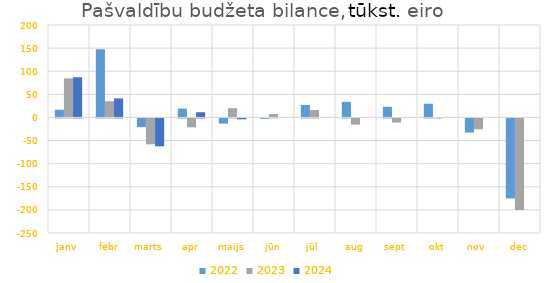
| Category | 2022 | 2023 | 2024 |
|---|---|---|---|
| janv | 16703.923 | 84479.098 | 86956.73 |
| febr | 147501.748 | 34983.794 | 41221.027 |
| marts | -18692.108 | -56013.768 | -60330.828 |
| apr | 19123.02 | -19285.064 | 11332.866 |
| maijs | -11153.489 | 20083.006 | -1951.727 |
| jūn | -682.628 | 7354.828 | 0 |
| jūl | 26988.29 | 15950.076 | 0 |
| aug | 33769.918 | -13326.082 | 0 |
| sept | 23100.994 | -8815.561 | 0 |
| okt | 29746.087 | 166.102 | 0 |
| nov | -30579.652 | -23436.839 | 0 |
| dec | -172941.944 | -198139.706 | 0 |